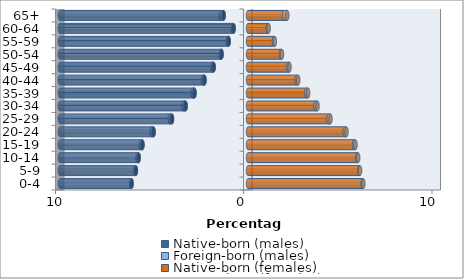
| Category | Native-born (males) | Foreign-born (males) | Native-born (females) | Foreign-born (females) |
|---|---|---|---|---|
| 0-4 | -6.183 | -0.033 | 6.095 | 0.035 |
| 5-9 | -5.955 | -0.047 | 5.909 | 0.046 |
| 10-14 | -5.808 | -0.069 | 5.794 | 0.061 |
| 15-19 | -5.607 | -0.095 | 5.633 | 0.078 |
| 20-24 | -5.014 | -0.114 | 5.141 | 0.092 |
| 25-29 | -4.037 | -0.121 | 4.28 | 0.103 |
| 30-34 | -3.313 | -0.115 | 3.592 | 0.102 |
| 35-39 | -2.842 | -0.102 | 3.105 | 0.091 |
| 40-44 | -2.31 | -0.086 | 2.595 | 0.076 |
| 45-49 | -1.822 | -0.073 | 2.143 | 0.062 |
| 50-54 | -1.403 | -0.062 | 1.753 | 0.053 |
| 55-59 | -1.026 | -0.053 | 1.38 | 0.047 |
| 60-64 | -0.763 | -0.045 | 1.054 | 0.044 |
| 65+ | -1.293 | -0.16 | 1.919 | 0.169 |